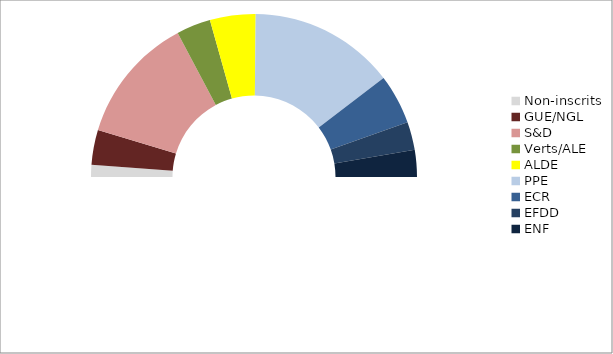
| Category | Series 0 |
|---|---|
| Non-inscrits | 18 |
| GUE/NGL | 52 |
| S&D | 189 |
| Verts/ALE | 51 |
| ALDE | 68 |
| PPE | 217 |
| ECR | 74 |
| EFDD | 42 |
| ENF | 40 |
| Autre | 751 |